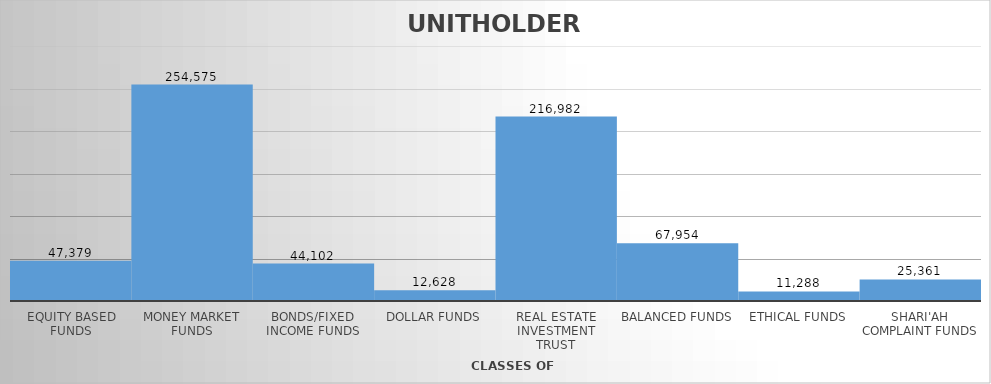
| Category | UNIT HOLDERS |
|---|---|
| EQUITY BASED FUNDS | 47379 |
| MONEY MARKET FUNDS | 254575 |
| BONDS/FIXED INCOME FUNDS | 44102 |
| DOLLAR FUNDS | 12628 |
| REAL ESTATE INVESTMENT TRUST | 216982 |
| BALANCED FUNDS | 67954 |
| ETHICAL FUNDS | 11288 |
| SHARI'AH COMPLAINT FUNDS | 25361 |